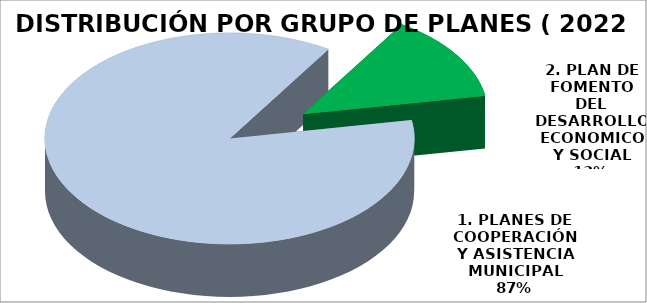
| Category | IMPORTE |
|---|---|
| 1. PLANES DE COOPERACIÓN Y ASISTENCIA MUNICIPAL | 84827296.87 |
| 2. PLAN DE FOMENTO DEL DESARROLLO ECONOMICO Y SOCIAL | 12958056.77 |